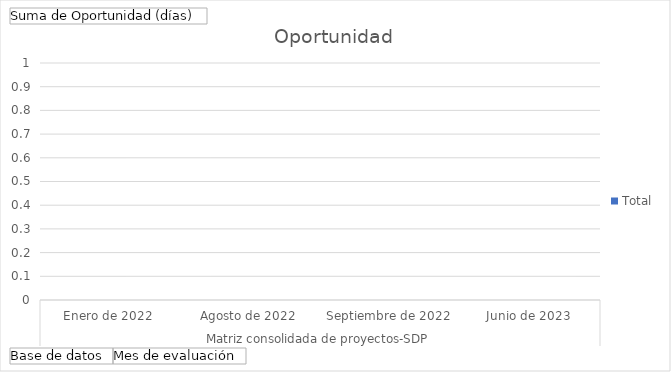
| Category | Total |
|---|---|
| 0 | 0 |
| 1 | 0 |
| 2 | 0 |
| 3 | 0 |